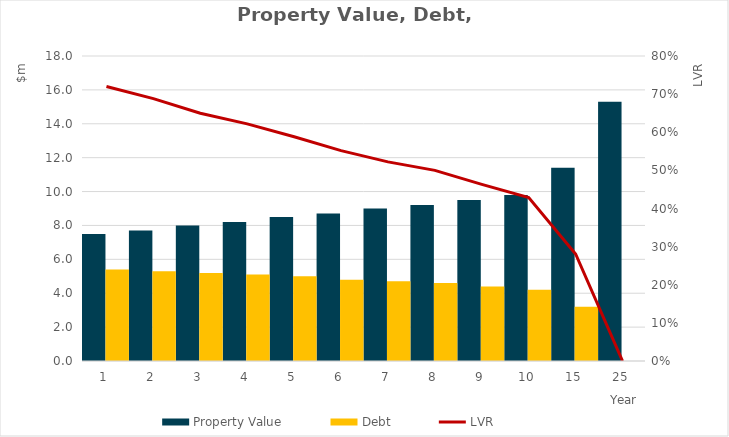
| Category | ICR (x) | DSCR (x) |
|---|---|---|
| 1.0 | 1.24 | 1.03 |
| 2.0 | 1.28 | 1.05 |
| 3.0 | 1.32 | 1.07 |
| 4.0 | 1.56 | 1.17 |
| 5.0 | 1.61 | 1.18 |
| 6.0 | 1.41 | 1.01 |
| 7.0 | 1.47 | 1.03 |
| 8.0 | 1.54 | 1.05 |
| 9.0 | 1.63 | 1.07 |
| 10.0 | 1.59 | 1.01 |
| 15.0 | 2.23 | 1.12 |
| 25.0 | 22.28 | 1.36 |